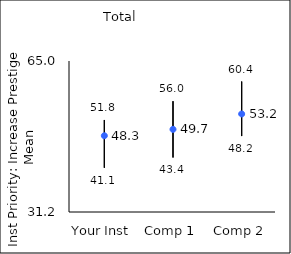
| Category | 25th percentile | 75th percentile | Mean |
|---|---|---|---|
| Your Inst | 41.1 | 51.8 | 48.27 |
| Comp 1 | 43.4 | 56 | 49.7 |
| Comp 2 | 48.2 | 60.4 | 53.15 |